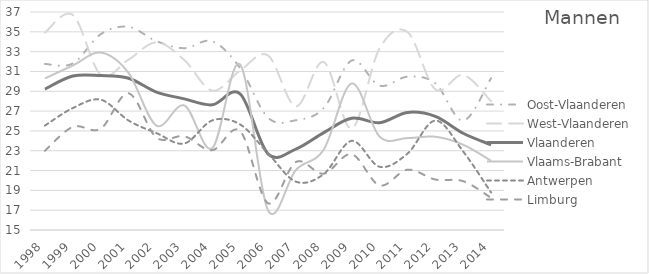
| Category | Oost-Vlaanderen | West-Vlaanderen | Vlaanderen | Vlaams-Brabant | Antwerpen | Limburg |
|---|---|---|---|---|---|---|
| 1998 | 31.759 | 34.928 | 29.226 | 30.298 | 25.54 | 22.998 |
| 1999 | 31.805 | 36.701 | 30.539 | 31.603 | 27.306 | 25.407 |
| 2000 | 34.76 | 30.659 | 30.58 | 32.908 | 28.151 | 25.225 |
| 2001 | 35.502 | 32.193 | 30.309 | 30.847 | 26.047 | 28.794 |
| 2002 | 34.057 | 33.94 | 28.916 | 25.532 | 24.779 | 24.331 |
| 2003 | 33.349 | 32.149 | 28.236 | 27.567 | 23.732 | 24.46 |
| 2004 | 34.041 | 29.064 | 27.633 | 23.256 | 26.057 | 23.054 |
| 2005 | 31.346 | 31.084 | 28.738 | 31.7 | 25.653 | 24.98 |
| 2006 | 26.334 | 32.614 | 22.686 | 16.984 | 22.741 | 17.702 |
| 2007 | 26.077 | 27.476 | 23.17 | 21.062 | 19.878 | 21.86 |
| 2008 | 27.301 | 31.947 | 24.826 | 23.117 | 20.644 | 20.687 |
| 2009 | 32.105 | 25.247 | 26.275 | 29.79 | 23.994 | 22.649 |
| 2010 | 29.574 | 33.317 | 25.829 | 24.43 | 21.381 | 19.505 |
| 2011 | 30.467 | 34.991 | 26.864 | 24.276 | 22.702 | 21.083 |
| 2012 | 29.811 | 29.199 | 26.461 | 24.413 | 26.041 | 20.095 |
| 2013 | 26.031 | 30.648 | 24.763 | 23.609 | 22.924 | 19.926 |
| 2014 | 30.316 | 28.001 | 23.592 | 21.988 | 18.792 | 18.25 |